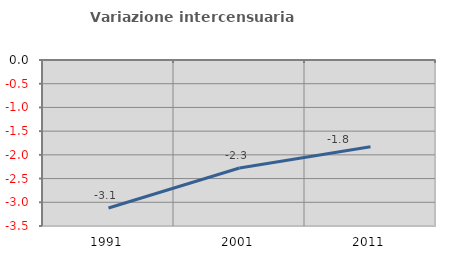
| Category | Variazione intercensuaria annua |
|---|---|
| 1991.0 | -3.122 |
| 2001.0 | -2.277 |
| 2011.0 | -1.83 |